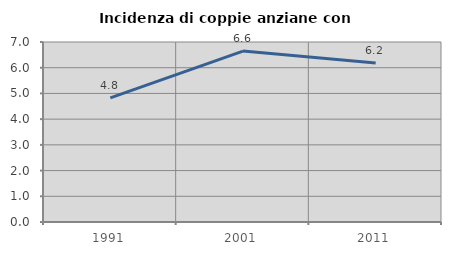
| Category | Incidenza di coppie anziane con figli |
|---|---|
| 1991.0 | 4.83 |
| 2001.0 | 6.647 |
| 2011.0 | 6.186 |